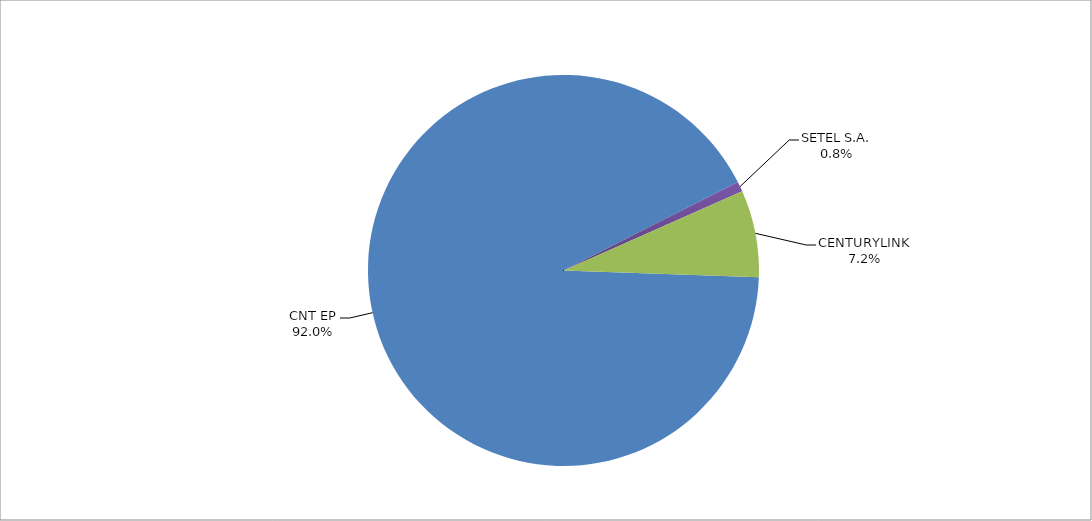
| Category | Series 0 |
|---|---|
| CNT EP | 332 |
| SETEL S.A. | 3 |
| CENTURYLINK | 26 |